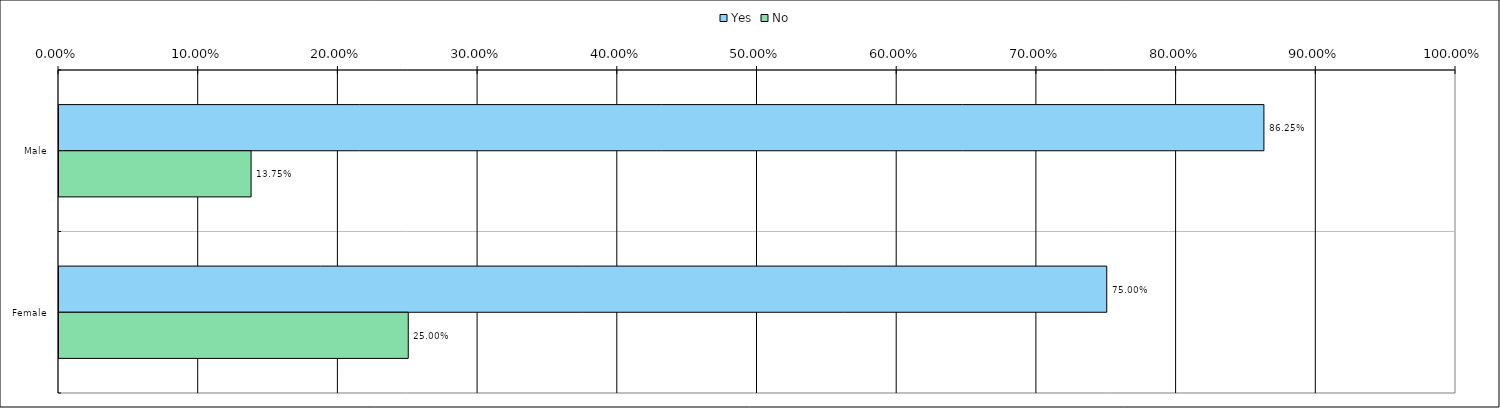
| Category | Yes | No |
|---|---|---|
| 0 | 0.862 | 0.138 |
| 1 | 0.75 | 0.25 |